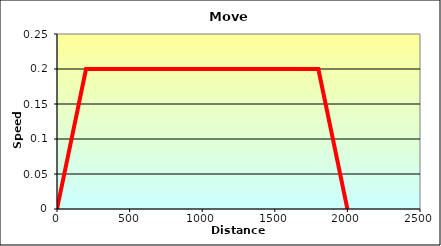
| Category | Series 0 |
|---|---|
| 0.0 | 0 |
| 200.0 | 0.2 |
| 1800.0 | 0.2 |
| 2000.0 | 0 |